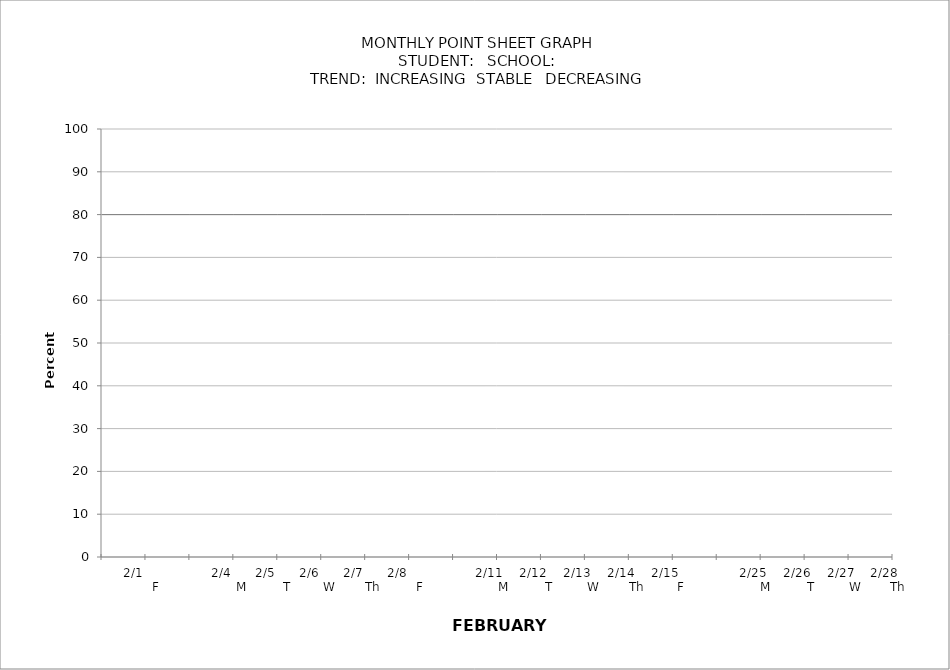
| Category | PERCENTAGE | target |
|---|---|---|
|  |  | 80 |
| 2/1            F |  | 80 |
|  |  | 80 |
| 2/4           M |  | 80 |
| 2/5            T |  | 80 |
| 2/6           W |  | 80 |
| 2/7           Th |  | 80 |
| 2/8            F |  | 80 |
|  |  | 80 |
| 2/11        M |  | 80 |
| 2/12         T |  | 80 |
| 2/13         W |  | 80 |
| 2/14         Th |  | 80 |
| 2/15         F |  | 80 |
|  |  | 80 |
| 2/25       M |  | 80 |
| 2/26        T |  | 80 |
| 2/27        W |  | 80 |
| 2/28        Th |  | 80 |